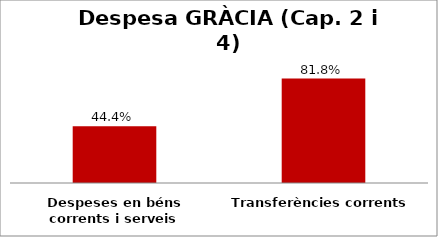
| Category | Series 0 |
|---|---|
| Despeses en béns corrents i serveis | 0.444 |
| Transferències corrents | 0.818 |